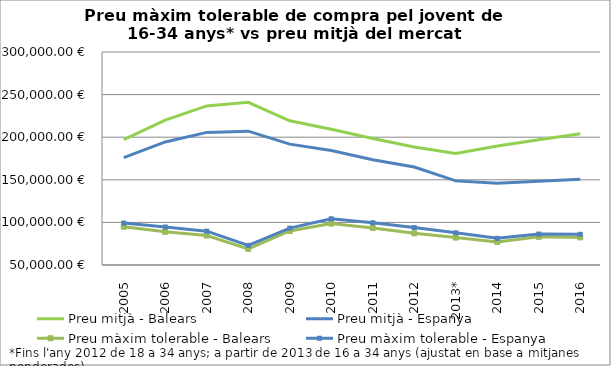
| Category | Preu mitjà - Balears | Preu mitjà - Espanya | Preu màxim tolerable - Balears | Preu màxim tolerable - Espanya |
|---|---|---|---|---|
| 2005 | 197225 | 176100 | 94889.06 | 99216 |
| 2006 | 219972.5 | 194427.5 | 88918.87 | 94573.49 |
| 2007 | 236745 | 205635 | 84545.25 | 89728 |
| 2008 | 240952.5 | 207107.5 | 69001.91 | 72980.53 |
| 2009 | 219235 | 191852.5 | 89922.1 | 93292.83 |
| 2010 | 209335 | 184302.5 | 98556.93 | 104255.67 |
| 2011 | 198513.333 | 173623.333 | 93469.687 | 99579.163 |
| 2012 | 188570 | 164930 | 87232.17 | 93913.94 |
| 2013* | 180985 | 148732.5 | 82157.565 | 87789.397 |
| 2014 | 189585 | 145940 | 77124.06 | 81268.287 |
| 2015 | 197120 | 148345 | 83114.694 | 86357.62 |
| 2016 | 204170 | 150640 | 82405.057 | 86023.49 |